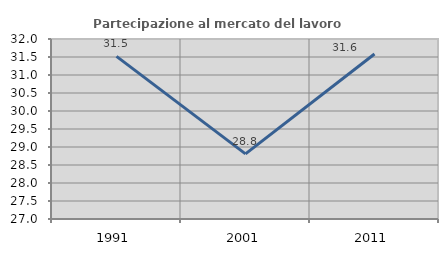
| Category | Partecipazione al mercato del lavoro  femminile |
|---|---|
| 1991.0 | 31.517 |
| 2001.0 | 28.808 |
| 2011.0 | 31.582 |